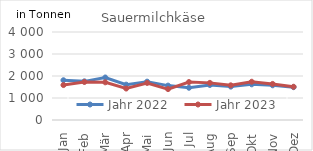
| Category | Jahr 2022 | Jahr 2023 |
|---|---|---|
| Jan | 1806.77 | 1588.667 |
| Feb | 1756.801 | 1729.942 |
| Mär | 1932.28 | 1712.795 |
| Apr | 1605.842 | 1430.296 |
| Mai | 1743.215 | 1684.704 |
| Jun | 1563.197 | 1405.44 |
| Jul | 1466.294 | 1724.795 |
| Aug | 1592.016 | 1687.576 |
| Sep | 1518.043 | 1575.899 |
| Okt | 1621.815 | 1739.131 |
| Nov | 1577.328 | 1639.609 |
| Dez | 1492.672 | 1511.097 |